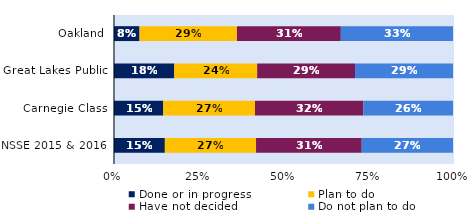
| Category | Done or in progress | Plan to do | Have not decided | Do not plan to do |
|---|---|---|---|---|
| Oakland | 0.075 | 0.287 | 0.306 | 0.331 |
| Great Lakes Public | 0.178 | 0.245 | 0.289 | 0.289 |
| Carnegie Class | 0.145 | 0.271 | 0.32 | 0.264 |
| NSSE 2015 & 2016 | 0.15 | 0.269 | 0.312 | 0.269 |